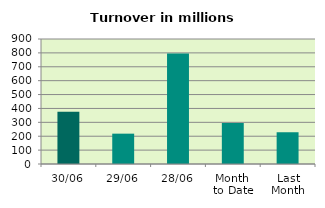
| Category | Series 0 |
|---|---|
| 30/06 | 375.837 |
| 29/06 | 218.463 |
| 28/06 | 794.86 |
| Month 
to Date | 295.453 |
| Last
Month | 228.645 |